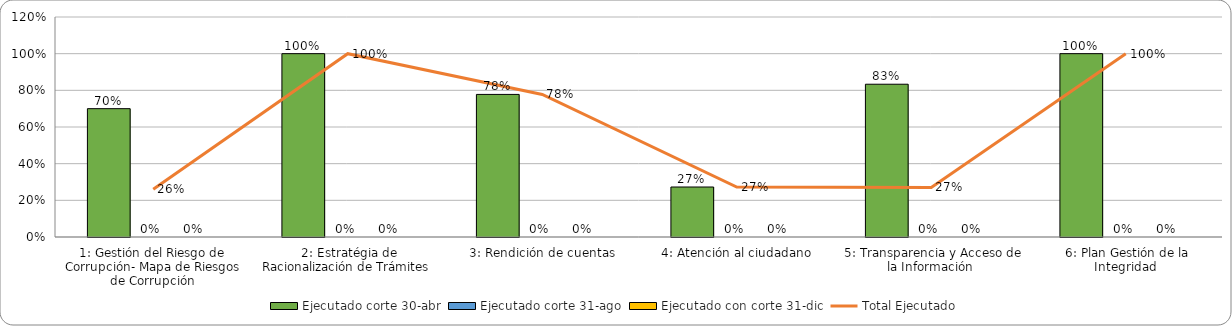
| Category | Ejecutado corte 30-abr | Ejecutado corte 31-ago | Ejecutado con corte 31-dic |
|---|---|---|---|
| 1: Gestión del Riesgo de Corrupción- Mapa de Riesgos de Corrupción | 0.7 | 0 | 0 |
|  2: Estratégia de Racionalización de Trámites | 1 | 0 | 0 |
|  3: Rendición de cuentas | 0.778 | 0 | 0 |
|  4: Atención al ciudadano | 0.273 | 0 | 0 |
|  5: Transparencia y Acceso de la Información | 0.833 | 0 | 0 |
|  6: Plan Gestión de la Integridad | 1 | 0 | 0 |